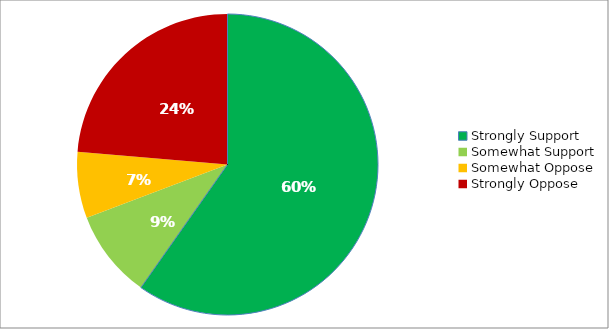
| Category | Responses |
|---|---|
| Strongly Support | 0.598 |
| Somewhat Support | 0.095 |
| Somewhat Oppose | 0.071 |
| Strongly Oppose | 0.236 |